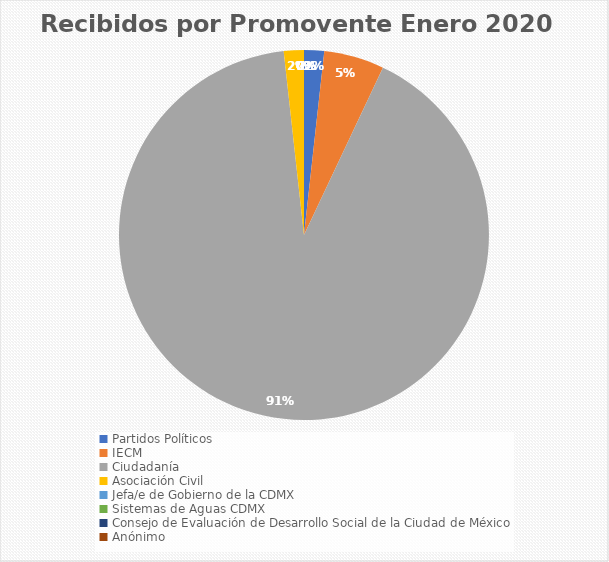
| Category | Recibidos por Promovente Enero |
|---|---|
| Partidos Políticos | 1 |
| IECM | 3 |
| Ciudadanía  | 52 |
| Asociación Civil | 1 |
| Jefa/e de Gobierno de la CDMX | 0 |
| Sistemas de Aguas CDMX | 0 |
| Consejo de Evaluación de Desarrollo Social de la Ciudad de México | 0 |
| Anónimo | 0 |